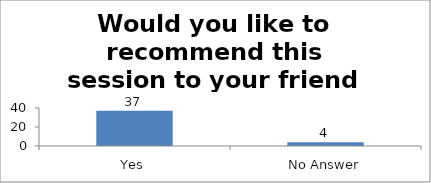
| Category | Would you like to recommend this session to your friend or colleague? |
|---|---|
| Yes | 37 |
| No Answer | 4 |